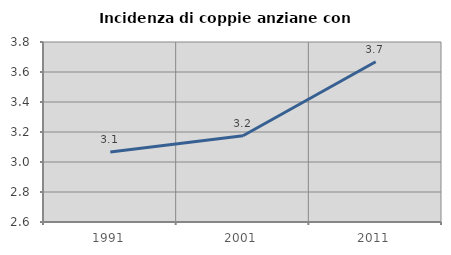
| Category | Incidenza di coppie anziane con figli |
|---|---|
| 1991.0 | 3.067 |
| 2001.0 | 3.175 |
| 2011.0 | 3.669 |